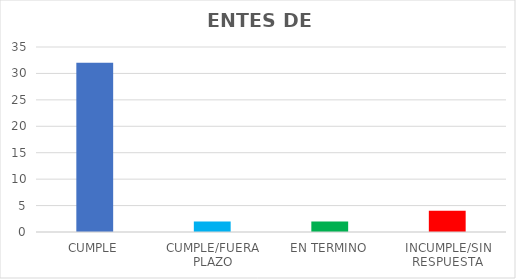
| Category | TOTAL |
|---|---|
| CUMPLE | 32 |
| CUMPLE/FUERA PLAZO | 2 |
| EN TERMINO | 2 |
| INCUMPLE/SIN RESPUESTA | 4 |